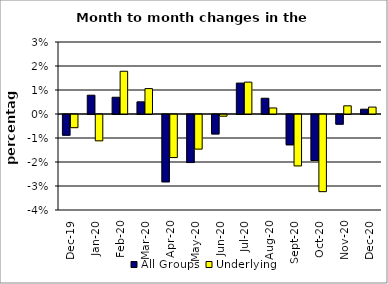
| Category | All Groups | Underlying |
|---|---|---|
| 2019-12-01 | -0.009 | -0.005 |
| 2020-01-01 | 0.008 | -0.011 |
| 2020-02-01 | 0.007 | 0.018 |
| 2020-03-01 | 0.005 | 0.011 |
| 2020-04-01 | -0.028 | -0.018 |
| 2020-05-01 | -0.02 | -0.014 |
| 2020-06-01 | -0.008 | -0.001 |
| 2020-07-01 | 0.013 | 0.013 |
| 2020-08-01 | 0.007 | 0.003 |
| 2020-09-01 | -0.013 | -0.021 |
| 2020-10-01 | -0.019 | -0.032 |
| 2020-11-01 | -0.004 | 0.003 |
| 2020-12-01 | 0.002 | 0.003 |